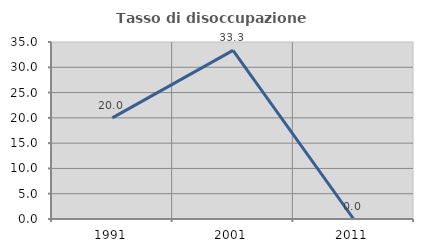
| Category | Tasso di disoccupazione giovanile  |
|---|---|
| 1991.0 | 20 |
| 2001.0 | 33.333 |
| 2011.0 | 0 |